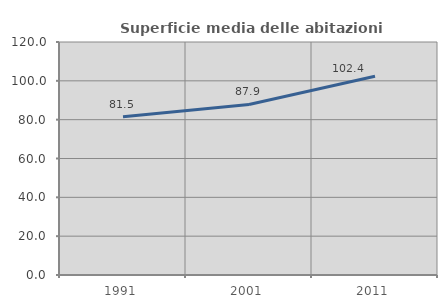
| Category | Superficie media delle abitazioni occupate |
|---|---|
| 1991.0 | 81.49 |
| 2001.0 | 87.852 |
| 2011.0 | 102.4 |